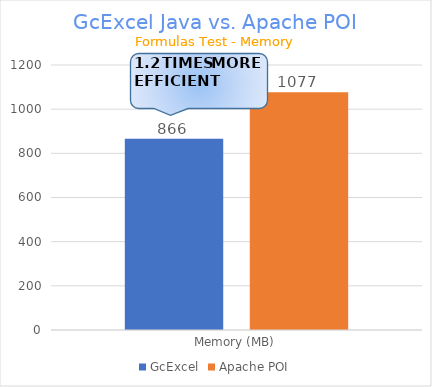
| Category | GcExcel | Apache POI |
|---|---|---|
| Memory (MB) | 866.416 | 1076.874 |